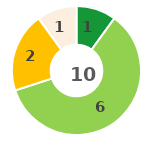
| Category | Series 0 |
|---|---|
| 0 | 1 |
| 1 | 6 |
| 2 | 2 |
| 3 | 0 |
| 4 | 1 |